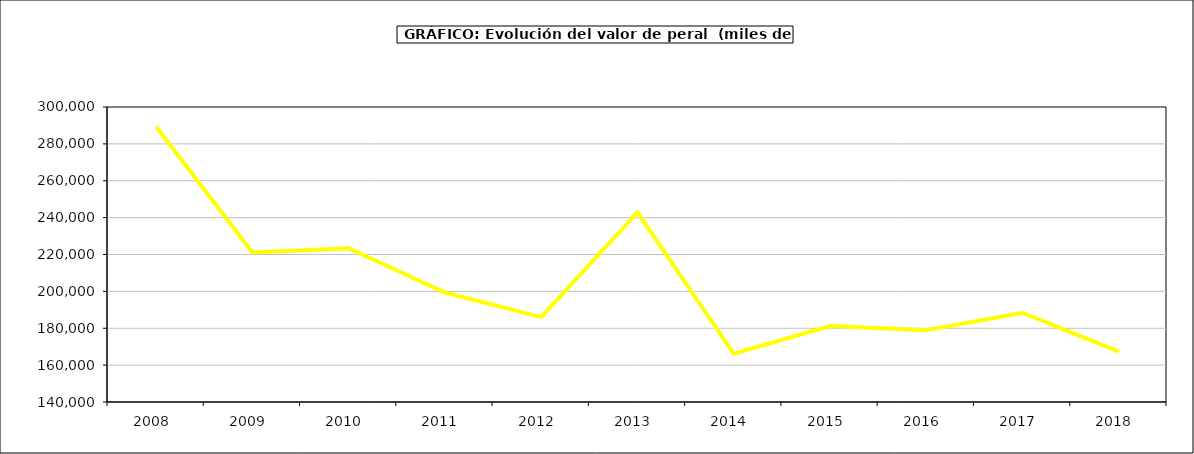
| Category | valor peral |
|---|---|
| 2008.0 | 289268.475 |
| 2009.0 | 221127.625 |
| 2010.0 | 223375.858 |
| 2011.0 | 199365.811 |
| 2012.0 | 186031.625 |
| 2013.0 | 242867.092 |
| 2014.0 | 166145.606 |
| 2015.0 | 181166 |
| 2016.0 | 178909 |
| 2017.0 | 188326.979 |
| 2018.0 | 167289.385 |